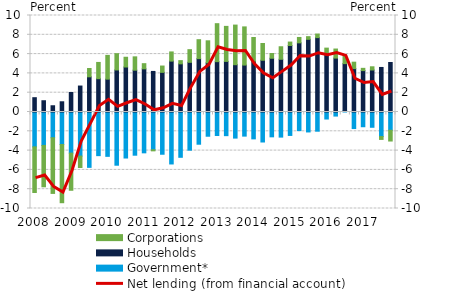
| Category | Government* | Households | Corporations |
|---|---|---|---|
| 2008.0 | -3.614 | 1.482 | -4.726 |
| nan | -3.465 | 1.167 | -4.286 |
| nan | -2.667 | 0.647 | -5.769 |
| nan | -3.365 | 1.06 | -6.035 |
| 2009.0 | -4.26 | 2.022 | -3.85 |
| nan | -4.568 | 2.69 | -1.185 |
| nan | -5.737 | 3.646 | 0.861 |
| nan | -4.523 | 3.452 | 1.684 |
| 2010.0 | -4.596 | 3.403 | 2.463 |
| nan | -5.515 | 4.357 | 1.688 |
| nan | -4.769 | 4.662 | 1.012 |
| nan | -4.478 | 4.334 | 1.381 |
| 2011.0 | -4.232 | 4.471 | 0.537 |
| nan | -3.914 | 4.204 | -0.111 |
| nan | -4.378 | 4.109 | 0.654 |
| nan | -5.386 | 5.273 | 0.951 |
| 2012.0 | -4.694 | 4.99 | 0.332 |
| nan | -3.959 | 5.147 | 1.313 |
| nan | -3.339 | 5.529 | 1.965 |
| nan | -2.511 | 5.095 | 2.283 |
| 2013.0 | -2.438 | 5.217 | 3.935 |
| nan | -2.452 | 5.243 | 3.629 |
| nan | -2.704 | 4.902 | 4.105 |
| nan | -2.499 | 4.863 | 3.957 |
| 2014.0 | -2.784 | 5.255 | 2.466 |
| nan | -3.109 | 5.362 | 1.739 |
| nan | -2.575 | 5.569 | 0.494 |
| nan | -2.602 | 5.462 | 1.299 |
| 2015.0 | -2.428 | 6.893 | 0.355 |
| nan | -1.927 | 7.166 | 0.557 |
| nan | -2.068 | 7.531 | 0.277 |
| nan | -1.989 | 7.706 | 0.374 |
| 2016.0 | -0.728 | 5.929 | 0.691 |
| nan | -0.421 | 5.586 | 0.939 |
| nan | 0.128 | 4.885 | 0.799 |
| nan | -1.716 | 4.497 | 0.666 |
| 2017.0 | -1.527 | 4.289 | 0.235 |
| nan | -1.583 | 4.353 | 0.332 |
| nan | -2.543 | 4.616 | -0.298 |
| nan | -1.891 | 5.131 | -1.116 |